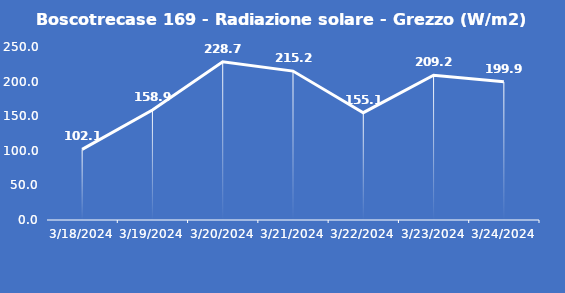
| Category | Boscotrecase 169 - Radiazione solare - Grezzo (W/m2) |
|---|---|
| 3/18/24 | 102.1 |
| 3/19/24 | 158.9 |
| 3/20/24 | 228.7 |
| 3/21/24 | 215.2 |
| 3/22/24 | 155.1 |
| 3/23/24 | 209.2 |
| 3/24/24 | 199.9 |